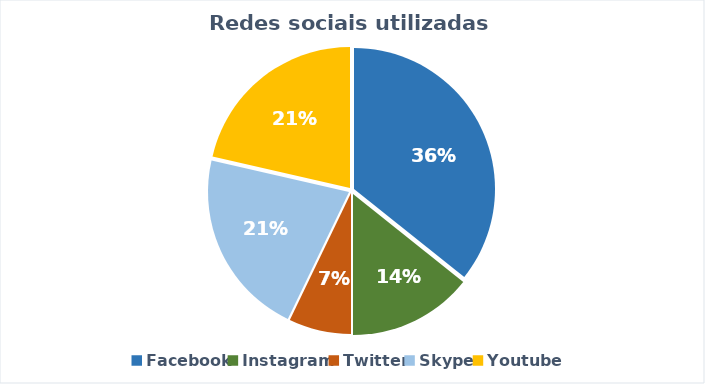
| Category | Series 0 |
|---|---|
| Facebook | 5 |
| Instagram | 2 |
| Twitter | 1 |
| Skype | 3 |
| Youtube | 3 |